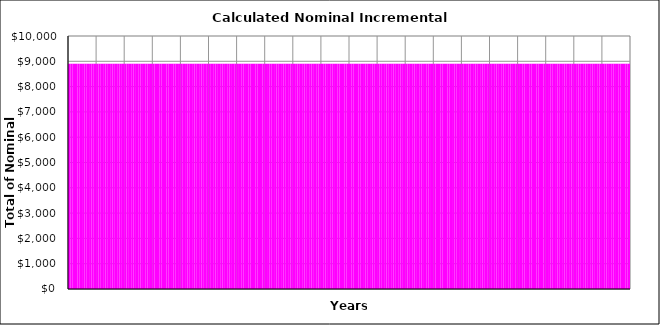
| Category | Stage (1) | Stage (2) | Stage (3) | Stage (4) | Stage (5) | Stage (6) | Stage (7) | Stage (8) | Stage (9) | Stage (10) |
|---|---|---|---|---|---|---|---|---|---|---|
| 0 | 8904.167 | 0 | 0 | 0 | 0 | 0 | 0 | 0 | 0 | 0 |
| 1 | 8904.167 | 0 | 0 | 0 | 0 | 0 | 0 | 0 | 0 | 0 |
| 2 | 8904.167 | 0 | 0 | 0 | 0 | 0 | 0 | 0 | 0 | 0 |
| 3 | 8904.167 | 0 | 0 | 0 | 0 | 0 | 0 | 0 | 0 | 0 |
| 4 | 8904.167 | 0 | 0 | 0 | 0 | 0 | 0 | 0 | 0 | 0 |
| 5 | 8904.167 | 0 | 0 | 0 | 0 | 0 | 0 | 0 | 0 | 0 |
| 6 | 8904.167 | 0 | 0 | 0 | 0 | 0 | 0 | 0 | 0 | 0 |
| 7 | 8904.167 | 0 | 0 | 0 | 0 | 0 | 0 | 0 | 0 | 0 |
| 8 | 8904.167 | 0 | 0 | 0 | 0 | 0 | 0 | 0 | 0 | 0 |
| 9 | 8904.167 | 0 | 0 | 0 | 0 | 0 | 0 | 0 | 0 | 0 |
| 10 | 8904.167 | 0 | 0 | 0 | 0 | 0 | 0 | 0 | 0 | 0 |
| 11 | 8904.167 | 0 | 0 | 0 | 0 | 0 | 0 | 0 | 0 | 0 |
| 12 | 8904.167 | 0 | 0 | 0 | 0 | 0 | 0 | 0 | 0 | 0 |
| 13 | 8904.167 | 0 | 0 | 0 | 0 | 0 | 0 | 0 | 0 | 0 |
| 14 | 8904.167 | 0 | 0 | 0 | 0 | 0 | 0 | 0 | 0 | 0 |
| 15 | 8904.167 | 0 | 0 | 0 | 0 | 0 | 0 | 0 | 0 | 0 |
| 16 | 8904.167 | 0 | 0 | 0 | 0 | 0 | 0 | 0 | 0 | 0 |
| 17 | 8904.167 | 0 | 0 | 0 | 0 | 0 | 0 | 0 | 0 | 0 |
| 18 | 8904.167 | 0 | 0 | 0 | 0 | 0 | 0 | 0 | 0 | 0 |
| 19 | 8904.167 | 0 | 0 | 0 | 0 | 0 | 0 | 0 | 0 | 0 |
| 20 | 8904.167 | 0 | 0 | 0 | 0 | 0 | 0 | 0 | 0 | 0 |
| 21 | 8904.167 | 0 | 0 | 0 | 0 | 0 | 0 | 0 | 0 | 0 |
| 22 | 8904.167 | 0 | 0 | 0 | 0 | 0 | 0 | 0 | 0 | 0 |
| 23 | 8904.167 | 0 | 0 | 0 | 0 | 0 | 0 | 0 | 0 | 0 |
| 24 | 8904.167 | 0 | 0 | 0 | 0 | 0 | 0 | 0 | 0 | 0 |
| 25 | 8904.167 | 0 | 0 | 0 | 0 | 0 | 0 | 0 | 0 | 0 |
| 26 | 8904.167 | 0 | 0 | 0 | 0 | 0 | 0 | 0 | 0 | 0 |
| 27 | 8904.167 | 0 | 0 | 0 | 0 | 0 | 0 | 0 | 0 | 0 |
| 28 | 8904.167 | 0 | 0 | 0 | 0 | 0 | 0 | 0 | 0 | 0 |
| 29 | 8904.167 | 0 | 0 | 0 | 0 | 0 | 0 | 0 | 0 | 0 |
| 30 | 8904.167 | 0 | 0 | 0 | 0 | 0 | 0 | 0 | 0 | 0 |
| 31 | 8904.167 | 0 | 0 | 0 | 0 | 0 | 0 | 0 | 0 | 0 |
| 32 | 8904.167 | 0 | 0 | 0 | 0 | 0 | 0 | 0 | 0 | 0 |
| 33 | 8904.167 | 0 | 0 | 0 | 0 | 0 | 0 | 0 | 0 | 0 |
| 34 | 8904.167 | 0 | 0 | 0 | 0 | 0 | 0 | 0 | 0 | 0 |
| 35 | 8904.167 | 0 | 0 | 0 | 0 | 0 | 0 | 0 | 0 | 0 |
| 36 | 8904.167 | 0 | 0 | 0 | 0 | 0 | 0 | 0 | 0 | 0 |
| 37 | 8904.167 | 0 | 0 | 0 | 0 | 0 | 0 | 0 | 0 | 0 |
| 38 | 8904.167 | 0 | 0 | 0 | 0 | 0 | 0 | 0 | 0 | 0 |
| 39 | 8904.167 | 0 | 0 | 0 | 0 | 0 | 0 | 0 | 0 | 0 |
| 40 | 8904.167 | 0 | 0 | 0 | 0 | 0 | 0 | 0 | 0 | 0 |
| 41 | 8904.167 | 0 | 0 | 0 | 0 | 0 | 0 | 0 | 0 | 0 |
| 42 | 8904.167 | 0 | 0 | 0 | 0 | 0 | 0 | 0 | 0 | 0 |
| 43 | 8904.167 | 0 | 0 | 0 | 0 | 0 | 0 | 0 | 0 | 0 |
| 44 | 8904.167 | 0 | 0 | 0 | 0 | 0 | 0 | 0 | 0 | 0 |
| 45 | 8904.167 | 0 | 0 | 0 | 0 | 0 | 0 | 0 | 0 | 0 |
| 46 | 8904.167 | 0 | 0 | 0 | 0 | 0 | 0 | 0 | 0 | 0 |
| 47 | 8904.167 | 0 | 0 | 0 | 0 | 0 | 0 | 0 | 0 | 0 |
| 48 | 8904.167 | 0 | 0 | 0 | 0 | 0 | 0 | 0 | 0 | 0 |
| 49 | 8904.167 | 0 | 0 | 0 | 0 | 0 | 0 | 0 | 0 | 0 |
| 50 | 8904.167 | 0 | 0 | 0 | 0 | 0 | 0 | 0 | 0 | 0 |
| 51 | 8904.167 | 0 | 0 | 0 | 0 | 0 | 0 | 0 | 0 | 0 |
| 52 | 8904.167 | 0 | 0 | 0 | 0 | 0 | 0 | 0 | 0 | 0 |
| 53 | 8904.167 | 0 | 0 | 0 | 0 | 0 | 0 | 0 | 0 | 0 |
| 54 | 8904.167 | 0 | 0 | 0 | 0 | 0 | 0 | 0 | 0 | 0 |
| 55 | 8904.167 | 0 | 0 | 0 | 0 | 0 | 0 | 0 | 0 | 0 |
| 56 | 8904.167 | 0 | 0 | 0 | 0 | 0 | 0 | 0 | 0 | 0 |
| 57 | 8904.167 | 0 | 0 | 0 | 0 | 0 | 0 | 0 | 0 | 0 |
| 58 | 8904.167 | 0 | 0 | 0 | 0 | 0 | 0 | 0 | 0 | 0 |
| 59 | 8904.167 | 0 | 0 | 0 | 0 | 0 | 0 | 0 | 0 | 0 |
| 60 | 8904.167 | 0 | 0 | 0 | 0 | 0 | 0 | 0 | 0 | 0 |
| 61 | 8904.167 | 0 | 0 | 0 | 0 | 0 | 0 | 0 | 0 | 0 |
| 62 | 8904.167 | 0 | 0 | 0 | 0 | 0 | 0 | 0 | 0 | 0 |
| 63 | 8904.167 | 0 | 0 | 0 | 0 | 0 | 0 | 0 | 0 | 0 |
| 64 | 8904.167 | 0 | 0 | 0 | 0 | 0 | 0 | 0 | 0 | 0 |
| 65 | 8904.167 | 0 | 0 | 0 | 0 | 0 | 0 | 0 | 0 | 0 |
| 66 | 8904.167 | 0 | 0 | 0 | 0 | 0 | 0 | 0 | 0 | 0 |
| 67 | 8904.167 | 0 | 0 | 0 | 0 | 0 | 0 | 0 | 0 | 0 |
| 68 | 8904.167 | 0 | 0 | 0 | 0 | 0 | 0 | 0 | 0 | 0 |
| 69 | 8904.167 | 0 | 0 | 0 | 0 | 0 | 0 | 0 | 0 | 0 |
| 70 | 8904.167 | 0 | 0 | 0 | 0 | 0 | 0 | 0 | 0 | 0 |
| 71 | 8904.167 | 0 | 0 | 0 | 0 | 0 | 0 | 0 | 0 | 0 |
| 72 | 8904.167 | 0 | 0 | 0 | 0 | 0 | 0 | 0 | 0 | 0 |
| 73 | 8904.167 | 0 | 0 | 0 | 0 | 0 | 0 | 0 | 0 | 0 |
| 74 | 8904.167 | 0 | 0 | 0 | 0 | 0 | 0 | 0 | 0 | 0 |
| 75 | 8904.167 | 0 | 0 | 0 | 0 | 0 | 0 | 0 | 0 | 0 |
| 76 | 8904.167 | 0 | 0 | 0 | 0 | 0 | 0 | 0 | 0 | 0 |
| 77 | 8904.167 | 0 | 0 | 0 | 0 | 0 | 0 | 0 | 0 | 0 |
| 78 | 8904.167 | 0 | 0 | 0 | 0 | 0 | 0 | 0 | 0 | 0 |
| 79 | 8904.167 | 0 | 0 | 0 | 0 | 0 | 0 | 0 | 0 | 0 |
| 80 | 8904.167 | 0 | 0 | 0 | 0 | 0 | 0 | 0 | 0 | 0 |
| 81 | 8904.167 | 0 | 0 | 0 | 0 | 0 | 0 | 0 | 0 | 0 |
| 82 | 8904.167 | 0 | 0 | 0 | 0 | 0 | 0 | 0 | 0 | 0 |
| 83 | 8904.167 | 0 | 0 | 0 | 0 | 0 | 0 | 0 | 0 | 0 |
| 84 | 8904.167 | 0 | 0 | 0 | 0 | 0 | 0 | 0 | 0 | 0 |
| 85 | 8904.167 | 0 | 0 | 0 | 0 | 0 | 0 | 0 | 0 | 0 |
| 86 | 8904.167 | 0 | 0 | 0 | 0 | 0 | 0 | 0 | 0 | 0 |
| 87 | 8904.167 | 0 | 0 | 0 | 0 | 0 | 0 | 0 | 0 | 0 |
| 88 | 8904.167 | 0 | 0 | 0 | 0 | 0 | 0 | 0 | 0 | 0 |
| 89 | 8904.167 | 0 | 0 | 0 | 0 | 0 | 0 | 0 | 0 | 0 |
| 90 | 8904.167 | 0 | 0 | 0 | 0 | 0 | 0 | 0 | 0 | 0 |
| 91 | 8904.167 | 0 | 0 | 0 | 0 | 0 | 0 | 0 | 0 | 0 |
| 92 | 8904.167 | 0 | 0 | 0 | 0 | 0 | 0 | 0 | 0 | 0 |
| 93 | 8904.167 | 0 | 0 | 0 | 0 | 0 | 0 | 0 | 0 | 0 |
| 94 | 8904.167 | 0 | 0 | 0 | 0 | 0 | 0 | 0 | 0 | 0 |
| 95 | 8904.167 | 0 | 0 | 0 | 0 | 0 | 0 | 0 | 0 | 0 |
| 96 | 8904.167 | 0 | 0 | 0 | 0 | 0 | 0 | 0 | 0 | 0 |
| 97 | 8904.167 | 0 | 0 | 0 | 0 | 0 | 0 | 0 | 0 | 0 |
| 98 | 8904.167 | 0 | 0 | 0 | 0 | 0 | 0 | 0 | 0 | 0 |
| 99 | 8904.167 | 0 | 0 | 0 | 0 | 0 | 0 | 0 | 0 | 0 |
| 100 | 8904.167 | 0 | 0 | 0 | 0 | 0 | 0 | 0 | 0 | 0 |
| 101 | 8904.167 | 0 | 0 | 0 | 0 | 0 | 0 | 0 | 0 | 0 |
| 102 | 8904.167 | 0 | 0 | 0 | 0 | 0 | 0 | 0 | 0 | 0 |
| 103 | 8904.167 | 0 | 0 | 0 | 0 | 0 | 0 | 0 | 0 | 0 |
| 104 | 8904.167 | 0 | 0 | 0 | 0 | 0 | 0 | 0 | 0 | 0 |
| 105 | 8904.167 | 0 | 0 | 0 | 0 | 0 | 0 | 0 | 0 | 0 |
| 106 | 8904.167 | 0 | 0 | 0 | 0 | 0 | 0 | 0 | 0 | 0 |
| 107 | 8904.167 | 0 | 0 | 0 | 0 | 0 | 0 | 0 | 0 | 0 |
| 108 | 8904.167 | 0 | 0 | 0 | 0 | 0 | 0 | 0 | 0 | 0 |
| 109 | 8904.167 | 0 | 0 | 0 | 0 | 0 | 0 | 0 | 0 | 0 |
| 110 | 8904.167 | 0 | 0 | 0 | 0 | 0 | 0 | 0 | 0 | 0 |
| 111 | 8904.167 | 0 | 0 | 0 | 0 | 0 | 0 | 0 | 0 | 0 |
| 112 | 8904.167 | 0 | 0 | 0 | 0 | 0 | 0 | 0 | 0 | 0 |
| 113 | 8904.167 | 0 | 0 | 0 | 0 | 0 | 0 | 0 | 0 | 0 |
| 114 | 8904.167 | 0 | 0 | 0 | 0 | 0 | 0 | 0 | 0 | 0 |
| 115 | 8904.167 | 0 | 0 | 0 | 0 | 0 | 0 | 0 | 0 | 0 |
| 116 | 8904.167 | 0 | 0 | 0 | 0 | 0 | 0 | 0 | 0 | 0 |
| 117 | 8904.167 | 0 | 0 | 0 | 0 | 0 | 0 | 0 | 0 | 0 |
| 118 | 8904.167 | 0 | 0 | 0 | 0 | 0 | 0 | 0 | 0 | 0 |
| 119 | 8904.167 | 0 | 0 | 0 | 0 | 0 | 0 | 0 | 0 | 0 |
| 120 | 8904.167 | 0 | 0 | 0 | 0 | 0 | 0 | 0 | 0 | 0 |
| 121 | 8904.167 | 0 | 0 | 0 | 0 | 0 | 0 | 0 | 0 | 0 |
| 122 | 8904.167 | 0 | 0 | 0 | 0 | 0 | 0 | 0 | 0 | 0 |
| 123 | 8904.167 | 0 | 0 | 0 | 0 | 0 | 0 | 0 | 0 | 0 |
| 124 | 8904.167 | 0 | 0 | 0 | 0 | 0 | 0 | 0 | 0 | 0 |
| 125 | 8904.167 | 0 | 0 | 0 | 0 | 0 | 0 | 0 | 0 | 0 |
| 126 | 8904.167 | 0 | 0 | 0 | 0 | 0 | 0 | 0 | 0 | 0 |
| 127 | 8904.167 | 0 | 0 | 0 | 0 | 0 | 0 | 0 | 0 | 0 |
| 128 | 8904.167 | 0 | 0 | 0 | 0 | 0 | 0 | 0 | 0 | 0 |
| 129 | 8904.167 | 0 | 0 | 0 | 0 | 0 | 0 | 0 | 0 | 0 |
| 130 | 8904.167 | 0 | 0 | 0 | 0 | 0 | 0 | 0 | 0 | 0 |
| 131 | 8904.167 | 0 | 0 | 0 | 0 | 0 | 0 | 0 | 0 | 0 |
| 132 | 8904.167 | 0 | 0 | 0 | 0 | 0 | 0 | 0 | 0 | 0 |
| 133 | 8904.167 | 0 | 0 | 0 | 0 | 0 | 0 | 0 | 0 | 0 |
| 134 | 8904.167 | 0 | 0 | 0 | 0 | 0 | 0 | 0 | 0 | 0 |
| 135 | 8904.167 | 0 | 0 | 0 | 0 | 0 | 0 | 0 | 0 | 0 |
| 136 | 8904.167 | 0 | 0 | 0 | 0 | 0 | 0 | 0 | 0 | 0 |
| 137 | 8904.167 | 0 | 0 | 0 | 0 | 0 | 0 | 0 | 0 | 0 |
| 138 | 8904.167 | 0 | 0 | 0 | 0 | 0 | 0 | 0 | 0 | 0 |
| 139 | 8904.167 | 0 | 0 | 0 | 0 | 0 | 0 | 0 | 0 | 0 |
| 140 | 8904.167 | 0 | 0 | 0 | 0 | 0 | 0 | 0 | 0 | 0 |
| 141 | 8904.167 | 0 | 0 | 0 | 0 | 0 | 0 | 0 | 0 | 0 |
| 142 | 8904.167 | 0 | 0 | 0 | 0 | 0 | 0 | 0 | 0 | 0 |
| 143 | 8904.167 | 0 | 0 | 0 | 0 | 0 | 0 | 0 | 0 | 0 |
| 144 | 8904.167 | 0 | 0 | 0 | 0 | 0 | 0 | 0 | 0 | 0 |
| 145 | 8904.167 | 0 | 0 | 0 | 0 | 0 | 0 | 0 | 0 | 0 |
| 146 | 8904.167 | 0 | 0 | 0 | 0 | 0 | 0 | 0 | 0 | 0 |
| 147 | 8904.167 | 0 | 0 | 0 | 0 | 0 | 0 | 0 | 0 | 0 |
| 148 | 8904.167 | 0 | 0 | 0 | 0 | 0 | 0 | 0 | 0 | 0 |
| 149 | 8904.167 | 0 | 0 | 0 | 0 | 0 | 0 | 0 | 0 | 0 |
| 150 | 8904.167 | 0 | 0 | 0 | 0 | 0 | 0 | 0 | 0 | 0 |
| 151 | 8904.167 | 0 | 0 | 0 | 0 | 0 | 0 | 0 | 0 | 0 |
| 152 | 8904.167 | 0 | 0 | 0 | 0 | 0 | 0 | 0 | 0 | 0 |
| 153 | 8904.167 | 0 | 0 | 0 | 0 | 0 | 0 | 0 | 0 | 0 |
| 154 | 8904.167 | 0 | 0 | 0 | 0 | 0 | 0 | 0 | 0 | 0 |
| 155 | 8904.167 | 0 | 0 | 0 | 0 | 0 | 0 | 0 | 0 | 0 |
| 156 | 8904.167 | 0 | 0 | 0 | 0 | 0 | 0 | 0 | 0 | 0 |
| 157 | 8904.167 | 0 | 0 | 0 | 0 | 0 | 0 | 0 | 0 | 0 |
| 158 | 8904.167 | 0 | 0 | 0 | 0 | 0 | 0 | 0 | 0 | 0 |
| 159 | 8904.167 | 0 | 0 | 0 | 0 | 0 | 0 | 0 | 0 | 0 |
| 160 | 8904.167 | 0 | 0 | 0 | 0 | 0 | 0 | 0 | 0 | 0 |
| 161 | 8904.167 | 0 | 0 | 0 | 0 | 0 | 0 | 0 | 0 | 0 |
| 162 | 8904.167 | 0 | 0 | 0 | 0 | 0 | 0 | 0 | 0 | 0 |
| 163 | 8904.167 | 0 | 0 | 0 | 0 | 0 | 0 | 0 | 0 | 0 |
| 164 | 8904.167 | 0 | 0 | 0 | 0 | 0 | 0 | 0 | 0 | 0 |
| 165 | 8904.167 | 0 | 0 | 0 | 0 | 0 | 0 | 0 | 0 | 0 |
| 166 | 8904.167 | 0 | 0 | 0 | 0 | 0 | 0 | 0 | 0 | 0 |
| 167 | 8904.167 | 0 | 0 | 0 | 0 | 0 | 0 | 0 | 0 | 0 |
| 168 | 8904.167 | 0 | 0 | 0 | 0 | 0 | 0 | 0 | 0 | 0 |
| 169 | 8904.167 | 0 | 0 | 0 | 0 | 0 | 0 | 0 | 0 | 0 |
| 170 | 8904.167 | 0 | 0 | 0 | 0 | 0 | 0 | 0 | 0 | 0 |
| 171 | 8904.167 | 0 | 0 | 0 | 0 | 0 | 0 | 0 | 0 | 0 |
| 172 | 8904.167 | 0 | 0 | 0 | 0 | 0 | 0 | 0 | 0 | 0 |
| 173 | 8904.167 | 0 | 0 | 0 | 0 | 0 | 0 | 0 | 0 | 0 |
| 174 | 8904.167 | 0 | 0 | 0 | 0 | 0 | 0 | 0 | 0 | 0 |
| 175 | 8904.167 | 0 | 0 | 0 | 0 | 0 | 0 | 0 | 0 | 0 |
| 176 | 8904.167 | 0 | 0 | 0 | 0 | 0 | 0 | 0 | 0 | 0 |
| 177 | 8904.167 | 0 | 0 | 0 | 0 | 0 | 0 | 0 | 0 | 0 |
| 178 | 8904.167 | 0 | 0 | 0 | 0 | 0 | 0 | 0 | 0 | 0 |
| 179 | 8904.167 | 0 | 0 | 0 | 0 | 0 | 0 | 0 | 0 | 0 |
| 180 | 8904.167 | 0 | 0 | 0 | 0 | 0 | 0 | 0 | 0 | 0 |
| 181 | 8904.167 | 0 | 0 | 0 | 0 | 0 | 0 | 0 | 0 | 0 |
| 182 | 8904.167 | 0 | 0 | 0 | 0 | 0 | 0 | 0 | 0 | 0 |
| 183 | 8904.167 | 0 | 0 | 0 | 0 | 0 | 0 | 0 | 0 | 0 |
| 184 | 8904.167 | 0 | 0 | 0 | 0 | 0 | 0 | 0 | 0 | 0 |
| 185 | 8904.167 | 0 | 0 | 0 | 0 | 0 | 0 | 0 | 0 | 0 |
| 186 | 8904.167 | 0 | 0 | 0 | 0 | 0 | 0 | 0 | 0 | 0 |
| 187 | 8904.167 | 0 | 0 | 0 | 0 | 0 | 0 | 0 | 0 | 0 |
| 188 | 8904.167 | 0 | 0 | 0 | 0 | 0 | 0 | 0 | 0 | 0 |
| 189 | 8904.167 | 0 | 0 | 0 | 0 | 0 | 0 | 0 | 0 | 0 |
| 190 | 8904.167 | 0 | 0 | 0 | 0 | 0 | 0 | 0 | 0 | 0 |
| 191 | 8904.167 | 0 | 0 | 0 | 0 | 0 | 0 | 0 | 0 | 0 |
| 192 | 8904.167 | 0 | 0 | 0 | 0 | 0 | 0 | 0 | 0 | 0 |
| 193 | 8904.167 | 0 | 0 | 0 | 0 | 0 | 0 | 0 | 0 | 0 |
| 194 | 8904.167 | 0 | 0 | 0 | 0 | 0 | 0 | 0 | 0 | 0 |
| 195 | 8904.167 | 0 | 0 | 0 | 0 | 0 | 0 | 0 | 0 | 0 |
| 196 | 8904.167 | 0 | 0 | 0 | 0 | 0 | 0 | 0 | 0 | 0 |
| 197 | 8904.167 | 0 | 0 | 0 | 0 | 0 | 0 | 0 | 0 | 0 |
| 198 | 8904.167 | 0 | 0 | 0 | 0 | 0 | 0 | 0 | 0 | 0 |
| 199 | 8904.167 | 0 | 0 | 0 | 0 | 0 | 0 | 0 | 0 | 0 |
| 200 | 8904.167 | 0 | 0 | 0 | 0 | 0 | 0 | 0 | 0 | 0 |
| 201 | 8904.167 | 0 | 0 | 0 | 0 | 0 | 0 | 0 | 0 | 0 |
| 202 | 8904.167 | 0 | 0 | 0 | 0 | 0 | 0 | 0 | 0 | 0 |
| 203 | 8904.167 | 0 | 0 | 0 | 0 | 0 | 0 | 0 | 0 | 0 |
| 204 | 8904.167 | 0 | 0 | 0 | 0 | 0 | 0 | 0 | 0 | 0 |
| 205 | 8904.167 | 0 | 0 | 0 | 0 | 0 | 0 | 0 | 0 | 0 |
| 206 | 8904.167 | 0 | 0 | 0 | 0 | 0 | 0 | 0 | 0 | 0 |
| 207 | 8904.167 | 0 | 0 | 0 | 0 | 0 | 0 | 0 | 0 | 0 |
| 208 | 8904.167 | 0 | 0 | 0 | 0 | 0 | 0 | 0 | 0 | 0 |
| 209 | 8904.167 | 0 | 0 | 0 | 0 | 0 | 0 | 0 | 0 | 0 |
| 210 | 8904.167 | 0 | 0 | 0 | 0 | 0 | 0 | 0 | 0 | 0 |
| 211 | 8904.167 | 0 | 0 | 0 | 0 | 0 | 0 | 0 | 0 | 0 |
| 212 | 8904.167 | 0 | 0 | 0 | 0 | 0 | 0 | 0 | 0 | 0 |
| 213 | 8904.167 | 0 | 0 | 0 | 0 | 0 | 0 | 0 | 0 | 0 |
| 214 | 8904.167 | 0 | 0 | 0 | 0 | 0 | 0 | 0 | 0 | 0 |
| 215 | 8904.167 | 0 | 0 | 0 | 0 | 0 | 0 | 0 | 0 | 0 |
| 216 | 8904.167 | 0 | 0 | 0 | 0 | 0 | 0 | 0 | 0 | 0 |
| 217 | 8904.167 | 0 | 0 | 0 | 0 | 0 | 0 | 0 | 0 | 0 |
| 218 | 8904.167 | 0 | 0 | 0 | 0 | 0 | 0 | 0 | 0 | 0 |
| 219 | 8904.167 | 0 | 0 | 0 | 0 | 0 | 0 | 0 | 0 | 0 |
| 220 | 8904.167 | 0 | 0 | 0 | 0 | 0 | 0 | 0 | 0 | 0 |
| 221 | 8904.167 | 0 | 0 | 0 | 0 | 0 | 0 | 0 | 0 | 0 |
| 222 | 8904.167 | 0 | 0 | 0 | 0 | 0 | 0 | 0 | 0 | 0 |
| 223 | 8904.167 | 0 | 0 | 0 | 0 | 0 | 0 | 0 | 0 | 0 |
| 224 | 8904.167 | 0 | 0 | 0 | 0 | 0 | 0 | 0 | 0 | 0 |
| 225 | 8904.167 | 0 | 0 | 0 | 0 | 0 | 0 | 0 | 0 | 0 |
| 226 | 8904.167 | 0 | 0 | 0 | 0 | 0 | 0 | 0 | 0 | 0 |
| 227 | 8904.167 | 0 | 0 | 0 | 0 | 0 | 0 | 0 | 0 | 0 |
| 228 | 8904.167 | 0 | 0 | 0 | 0 | 0 | 0 | 0 | 0 | 0 |
| 229 | 8904.167 | 0 | 0 | 0 | 0 | 0 | 0 | 0 | 0 | 0 |
| 230 | 8904.167 | 0 | 0 | 0 | 0 | 0 | 0 | 0 | 0 | 0 |
| 231 | 8904.167 | 0 | 0 | 0 | 0 | 0 | 0 | 0 | 0 | 0 |
| 232 | 8904.167 | 0 | 0 | 0 | 0 | 0 | 0 | 0 | 0 | 0 |
| 233 | 8904.167 | 0 | 0 | 0 | 0 | 0 | 0 | 0 | 0 | 0 |
| 234 | 8904.167 | 0 | 0 | 0 | 0 | 0 | 0 | 0 | 0 | 0 |
| 235 | 8904.167 | 0 | 0 | 0 | 0 | 0 | 0 | 0 | 0 | 0 |
| 236 | 8904.167 | 0 | 0 | 0 | 0 | 0 | 0 | 0 | 0 | 0 |
| 237 | 8904.167 | 0 | 0 | 0 | 0 | 0 | 0 | 0 | 0 | 0 |
| 238 | 8904.167 | 0 | 0 | 0 | 0 | 0 | 0 | 0 | 0 | 0 |
| 239 | 8904.167 | 0 | 0 | 0 | 0 | 0 | 0 | 0 | 0 | 0 |